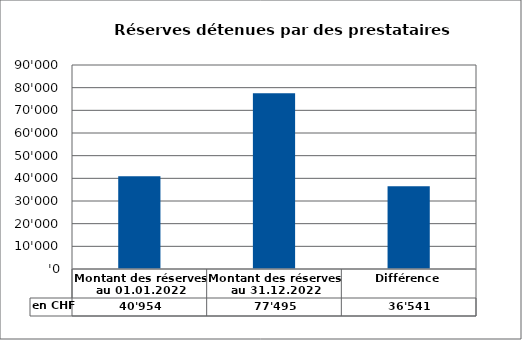
| Category | en CHF |
|---|---|
| Montant des réserves au 01.01.2022 | 40953.86 |
| Montant des réserves au 31.12.2022 | 77495 |
| Différence | 36541.14 |